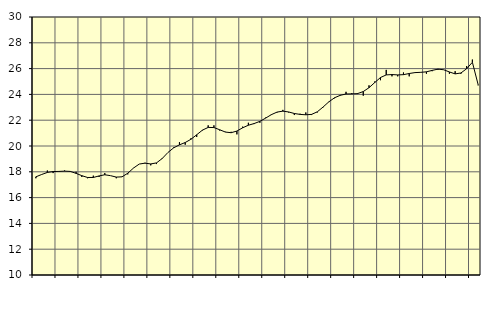
| Category | Piggar | Finansiell verksamhet, företagstjänster, SNI 64-82 |
|---|---|---|
| nan | 17.5 | 17.61 |
| 1.0 | 17.8 | 17.79 |
| 1.0 | 18.1 | 17.95 |
| 1.0 | 17.9 | 18.02 |
| nan | 18 | 18.03 |
| 2.0 | 18.1 | 18.05 |
| 2.0 | 18 | 18.03 |
| 2.0 | 18 | 17.88 |
| nan | 17.6 | 17.7 |
| 3.0 | 17.5 | 17.56 |
| 3.0 | 17.7 | 17.56 |
| 3.0 | 17.6 | 17.68 |
| nan | 17.9 | 17.77 |
| 4.0 | 17.7 | 17.7 |
| 4.0 | 17.5 | 17.59 |
| 4.0 | 17.6 | 17.61 |
| nan | 17.8 | 17.89 |
| 5.0 | 18.3 | 18.29 |
| 5.0 | 18.6 | 18.6 |
| 5.0 | 18.7 | 18.67 |
| nan | 18.5 | 18.61 |
| 6.0 | 18.6 | 18.69 |
| 6.0 | 19 | 19.03 |
| 6.0 | 19.5 | 19.5 |
| nan | 19.9 | 19.86 |
| 7.0 | 20.3 | 20.09 |
| 7.0 | 20.1 | 20.27 |
| 7.0 | 20.6 | 20.52 |
| nan | 20.7 | 20.87 |
| 8.0 | 21.2 | 21.23 |
| 8.0 | 21.6 | 21.44 |
| 8.0 | 21.6 | 21.43 |
| nan | 21.2 | 21.26 |
| 9.0 | 21.1 | 21.08 |
| 9.0 | 21.1 | 21.03 |
| 9.0 | 20.9 | 21.16 |
| nan | 21.5 | 21.41 |
| 10.0 | 21.8 | 21.61 |
| 10.0 | 21.7 | 21.74 |
| 10.0 | 21.8 | 21.91 |
| nan | 22.2 | 22.16 |
| 11.0 | 22.4 | 22.43 |
| 11.0 | 22.6 | 22.63 |
| 11.0 | 22.8 | 22.7 |
| nan | 22.6 | 22.64 |
| 12.0 | 22.4 | 22.52 |
| 12.0 | 22.5 | 22.45 |
| 12.0 | 22.6 | 22.42 |
| nan | 22.4 | 22.45 |
| 13.0 | 22.6 | 22.65 |
| 13.0 | 23 | 23.02 |
| 13.0 | 23.4 | 23.42 |
| nan | 23.7 | 23.74 |
| 14.0 | 23.9 | 23.93 |
| 14.0 | 24.2 | 24.03 |
| 14.0 | 24.1 | 24.04 |
| nan | 24.1 | 24.06 |
| 15.0 | 23.9 | 24.22 |
| 15.0 | 24.7 | 24.52 |
| 15.0 | 25 | 24.92 |
| nan | 25.1 | 25.31 |
| 16.0 | 25.9 | 25.51 |
| 16.0 | 25.4 | 25.54 |
| 16.0 | 25.4 | 25.51 |
| nan | 25.7 | 25.53 |
| 17.0 | 25.4 | 25.62 |
| 17.0 | 25.7 | 25.69 |
| 17.0 | 25.7 | 25.71 |
| nan | 25.6 | 25.75 |
| 18.0 | 25.8 | 25.86 |
| 18.0 | 25.9 | 25.96 |
| 18.0 | 25.9 | 25.91 |
| nan | 25.6 | 25.74 |
| 19.0 | 25.8 | 25.59 |
| 19.0 | 25.6 | 25.66 |
| 19.0 | 26.2 | 25.99 |
| nan | 26.7 | 26.49 |
| 20.0 | 24.7 | 24.76 |